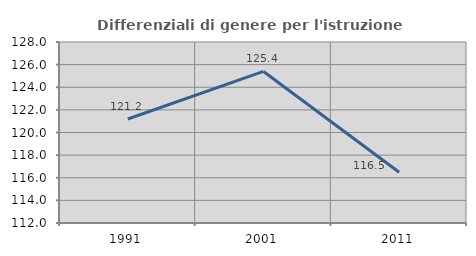
| Category | Differenziali di genere per l'istruzione superiore |
|---|---|
| 1991.0 | 121.19 |
| 2001.0 | 125.396 |
| 2011.0 | 116.492 |